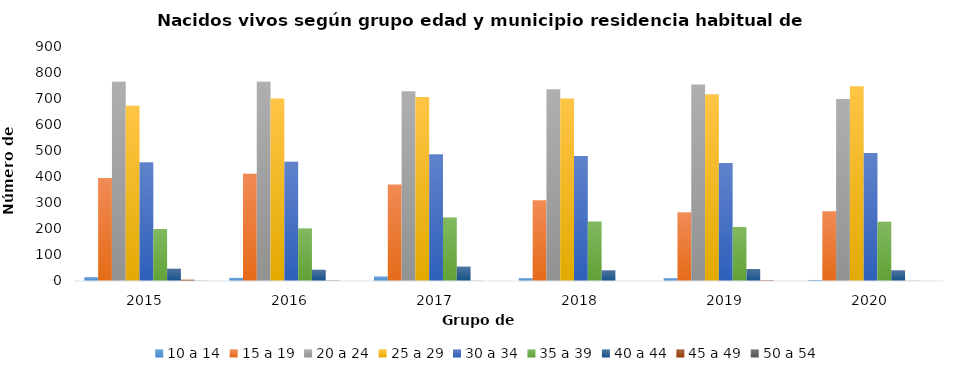
| Category | 10 a 14 | 15 a 19 | 20 a 24 | 25 a 29 | 30 a 34 | 35 a 39 | 40 a 44 | 45 a 49 | 50 a 54 |
|---|---|---|---|---|---|---|---|---|---|
| 2015.0 | 15 | 394 | 763 | 671 | 455 | 199 | 47 | 5 | 1 |
| 2016.0 | 12 | 411 | 763 | 699 | 457 | 201 | 43 | 2 | 0 |
| 2017.0 | 17 | 370 | 727 | 705 | 485 | 243 | 55 | 1 | 0 |
| 2018.0 | 11 | 309 | 733 | 699 | 479 | 228 | 41 | 0 | 0 |
| 2019.0 | 11 | 262 | 753 | 714 | 452 | 207 | 46 | 3 | 0 |
| 2020.0 | 4 | 267 | 697 | 746 | 490 | 227 | 41 | 1 | 0 |